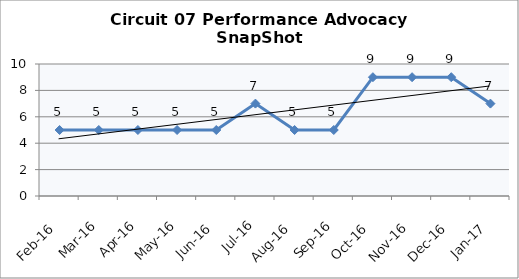
| Category | Circuit 07 |
|---|---|
| Feb-16 | 5 |
| Mar-16 | 5 |
| Apr-16 | 5 |
| May-16 | 5 |
| Jun-16 | 5 |
| Jul-16 | 7 |
| Aug-16 | 5 |
| Sep-16 | 5 |
| Oct-16 | 9 |
| Nov-16 | 9 |
| Dec-16 | 9 |
| Jan-17 | 7 |